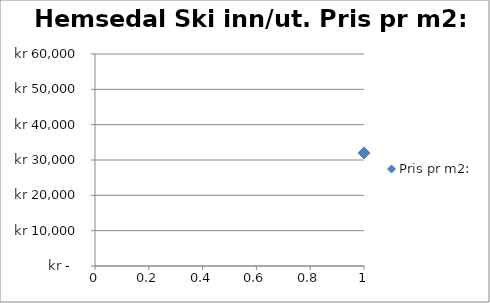
| Category | Pris pr m2: |
|---|---|
| 0 | 31991 |
| 1 | 36429 |
| 2 | 39623 |
| 3 | 30435 |
| 4 | 35849 |
| 5 | 32520 |
| 6 | 36667 |
| 7 | 30217 |
| 8 | 40807 |
| 9 | 34466 |
| 10 | 35780 |
| 11 | 34593 |
| 12 | 37857 |
| 13 | 47586 |
| 14 | 32083 |
| 15 | 27778 |
| 16 | 29545 |
| 17 | 43452 |
| 18 | 35106 |
| 19 | 37959 |
| 20 | 35250 |
| 21 | 36275 |
| 22 | 16292 |
| 23 | 32409 |
| 24 | 29412 |
| 25 | 31818 |
| 26 | 21154 |
| 27 | 31818 |
| 28 | 42568 |
| 29 | 34615 |
| 30 | 31818 |
| 31 | 48113 |
| 32 | 42308 |
| 33 | 44444 |
| 34 | 37805 |
| 35 | 40208 |
| 36 | 45522 |
| 37 | 48413 |
| 38 | 24277 |
| 39 | 37300 |
| 40 | 41606 |
| 41 | 37000 |
| 42 | 39098 |
| 43 | 16810 |
| 44 | 47664 |
| 45 | 32528 |
| 46 | 36275 |
| 47 | 30690 |
| 48 | 44318 |
| 49 | 42857 |
| 50 | 47361 |
| 51 | 32738 |
| 52 | 42969 |
| 53 | 49468 |
| 54 | 45714 |
| 55 | 35556 |
| 56 | 47917 |